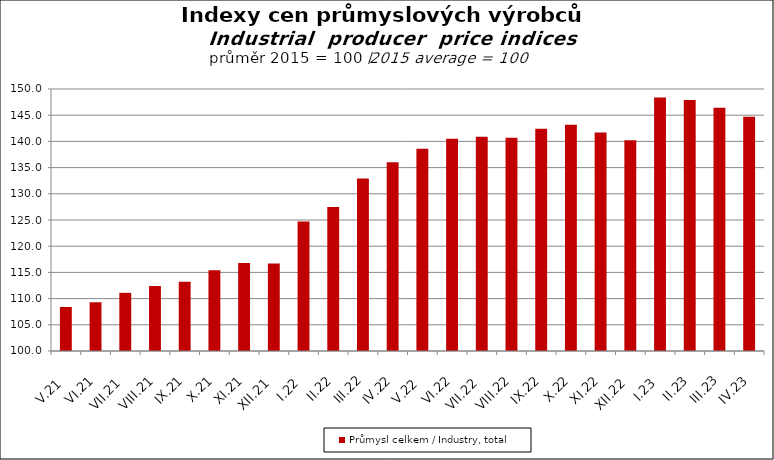
| Category | Průmysl celkem / Industry, total |
|---|---|
| V.21 | 108.4 |
| VI.21 | 109.3 |
| VII.21 | 111.1 |
| VIII.21 | 112.4 |
| IX.21 | 113.2 |
| X.21 | 115.4 |
| XI.21 | 116.8 |
| XII.21 | 116.7 |
| I.22 | 124.7 |
| II.22 | 127.5 |
| III.22 | 132.9 |
| IV.22 | 136 |
| V.22 | 138.6 |
| VI.22 | 140.5 |
| VII.22 | 140.9 |
| VIII.22 | 140.7 |
| IX.22 | 142.4 |
| X.22 | 143.2 |
| XI.22 | 141.7 |
| XII.22 | 140.2 |
| I.23 | 148.4 |
| II.23 | 147.9 |
| III.23 | 146.4 |
| IV.23 | 144.7 |